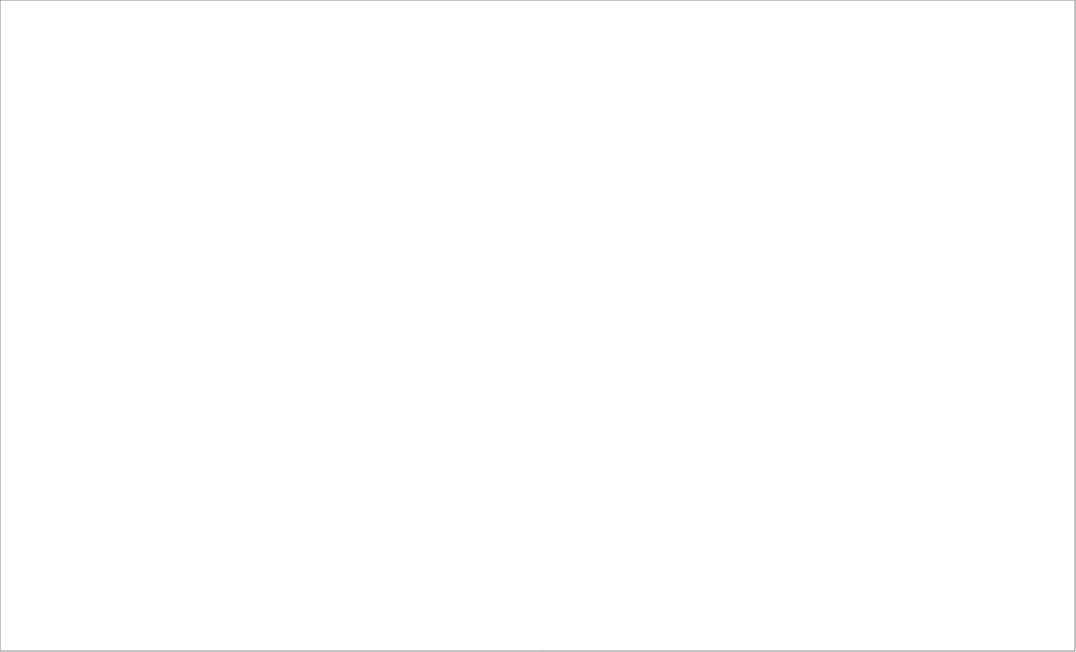
| Category | Series 0 |
|---|---|
| Courses alimentaires | 0 |
| Courses non-alimentaires / matériel | 0 |
| Cigarettes | 0 |
| Réparation voiture | 0 |
| Livres / musique / jeux | 0 |
| Vêtements | 0 |
| Bricolage et jardinage | 0 |
| Restaurants / bars | 0 |
| Spectacles / concerts | 0 |
| Esthétique | 0 |
| Sport | 0 |
| Vacances / voyages | 0 |
| Dons | 0 |
| Cadeaux | 0 |
| Frais de santé | 0 |
| Animaux | 0 |
| Formations / frais de scolarité | 0 |
| Autres divers | 0 |
| Autres divers | 0 |
| Autres divers | 0 |